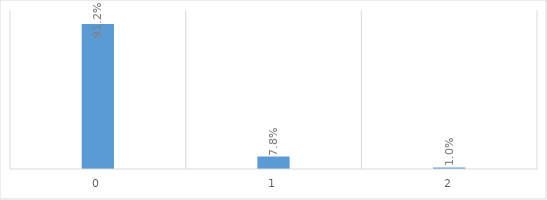
| Category | Series 0 |
|---|---|
| 0.0 | 0.912 |
| 1.0 | 0.078 |
| 2.0 | 0.01 |